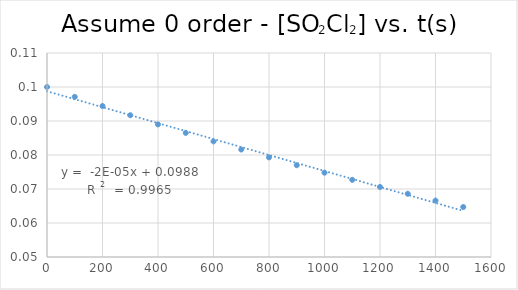
| Category | Series 0 |
|---|---|
| 0.0 | 0.1 |
| 100.0 | 0.097 |
| 200.0 | 0.094 |
| 300.0 | 0.092 |
| 400.0 | 0.089 |
| 500.0 | 0.086 |
| 600.0 | 0.084 |
| 700.0 | 0.082 |
| 800.0 | 0.079 |
| 900.0 | 0.077 |
| 1000.0 | 0.075 |
| 1100.0 | 0.073 |
| 1200.0 | 0.071 |
| 1300.0 | 0.069 |
| 1400.0 | 0.067 |
| 1500.0 | 0.065 |